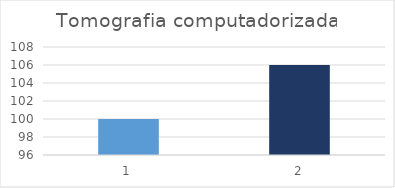
| Category | Tomografia computadorizada |
|---|---|
| 0 | 100 |
| 1 | 106 |